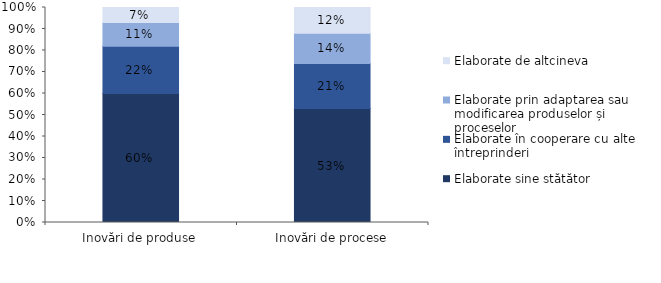
| Category | Elaborate sine stătător | Elaborate în cooperare cu alte întreprinderi  | Elaborate prin adaptarea sau modificarea produselor și proceselor | Elaborate de altcineva |
|---|---|---|---|---|
| Inovări de produse | 0.6 | 0.22 | 0.11 | 0.07 |
| Inovări de procese | 0.53 | 0.21 | 0.14 | 0.12 |